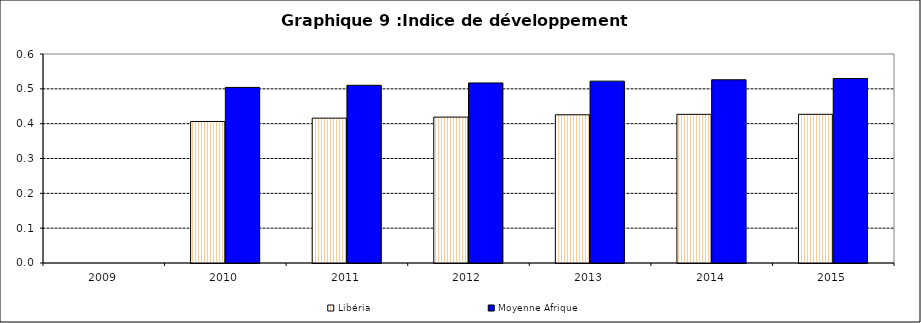
| Category | Libéria | Moyenne Afrique |
|---|---|---|
| 2009.0 | 0 | 0 |
| 2010.0 | 0.406 | 0.504 |
| 2011.0 | 0.416 | 0.51 |
| 2012.0 | 0.419 | 0.517 |
| 2013.0 | 0.425 | 0.522 |
| 2014.0 | 0.427 | 0.526 |
| 2015.0 | 0.427 | 0.53 |